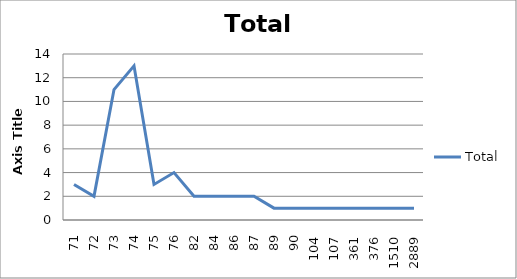
| Category | Total |
|---|---|
| 71 | 3 |
| 72 | 2 |
| 73 | 11 |
| 74 | 13 |
| 75 | 3 |
| 76 | 4 |
| 82 | 2 |
| 84 | 2 |
| 86 | 2 |
| 87 | 2 |
| 89 | 1 |
| 90 | 1 |
| 104 | 1 |
| 107 | 1 |
| 361 | 1 |
| 376 | 1 |
| 1510 | 1 |
| 2889 | 1 |